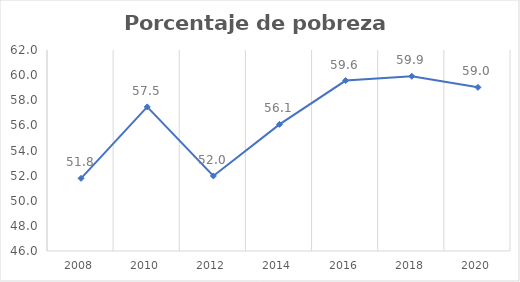
| Category | Series 0 |
|---|---|
| 2008.0 | 51.785 |
| 2010.0 | 57.47 |
| 2012.0 | 51.973 |
| 2014.0 | 56.082 |
| 2016.0 | 59.569 |
| 2018.0 | 59.908 |
| 2020.0 | 59.026 |